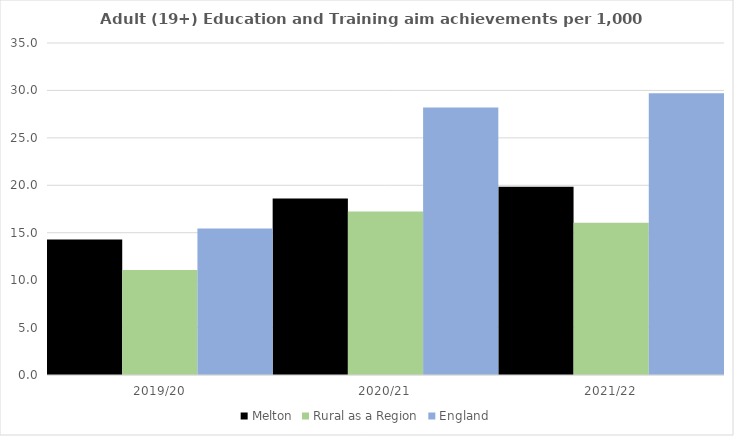
| Category | Melton | Rural as a Region | England |
|---|---|---|---|
| 2019/20 | 14.29 | 11.081 | 15.446 |
| 2020/21 | 18.617 | 17.224 | 28.211 |
| 2021/22 | 19.834 | 16.063 | 29.711 |